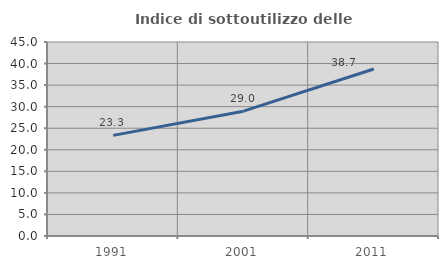
| Category | Indice di sottoutilizzo delle abitazioni  |
|---|---|
| 1991.0 | 23.337 |
| 2001.0 | 28.95 |
| 2011.0 | 38.728 |